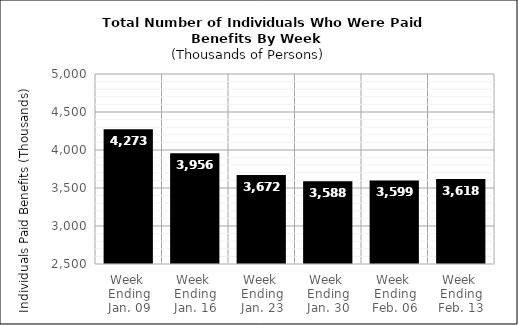
| Category | Series 0 |
|---|---|
| Week 
Ending
Jan. 09 | 4273 |
| Week 
Ending
Jan. 16 | 3956 |
| Week 
Ending
Jan. 23 | 3672 |
| Week 
Ending
Jan. 30 | 3588 |
| Week 
Ending
Feb. 06 | 3599 |
| Week 
Ending
Feb. 13 | 3618 |